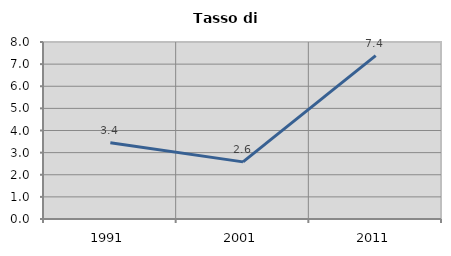
| Category | Tasso di disoccupazione   |
|---|---|
| 1991.0 | 3.448 |
| 2001.0 | 2.582 |
| 2011.0 | 7.384 |